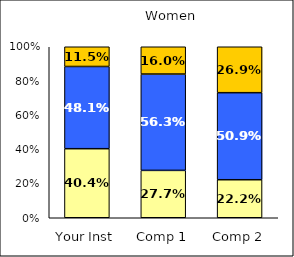
| Category | Low Job Satisfaction: Compensation | Average Job Satisfaction: Compensation | High Job Satisfaction: Compensation |
|---|---|---|---|
| Your Inst | 0.404 | 0.481 | 0.115 |
| Comp 1 | 0.277 | 0.563 | 0.16 |
| Comp 2 | 0.222 | 0.509 | 0.269 |